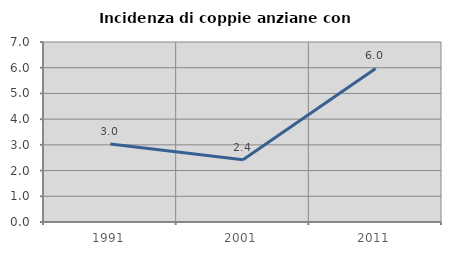
| Category | Incidenza di coppie anziane con figli |
|---|---|
| 1991.0 | 3.03 |
| 2001.0 | 2.419 |
| 2011.0 | 5.97 |